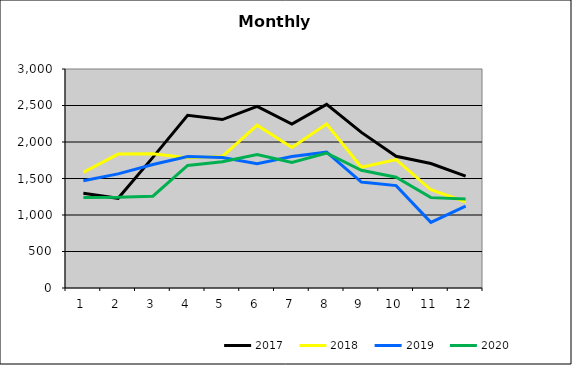
| Category | 2017 | 2018 | 2019 | 2020 |
|---|---|---|---|---|
| 0 | 1297.347 | 1584.945 | 1467.961 | 1241.004 |
| 1 | 1228.546 | 1834.566 | 1563.301 | 1241.851 |
| 2 | 1789.782 | 1838.878 | 1692.17 | 1257.948 |
| 3 | 2364.914 | 1785.082 | 1799.954 | 1678.799 |
| 4 | 2307.576 | 1801.761 | 1787.008 | 1728.302 |
| 5 | 2488.575 | 2229.629 | 1700.928 | 1828.684 |
| 6 | 2244.746 | 1923.685 | 1800.379 | 1719.368 |
| 7 | 2515.952 | 2246.519 | 1860.378 | 1849.008 |
| 8 | 2131.972 | 1654.017 | 1451.067 | 1612.218 |
| 9 | 1804.009 | 1760.102 | 1402.587 | 1517.604 |
| 10 | 1705.861 | 1345.712 | 899.124 | 1237.91 |
| 11 | 1533.212 | 1179.594 | 1120.919 | 1217.682 |